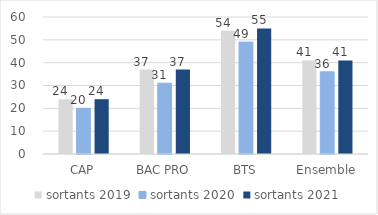
| Category | sortants 2019 | sortants 2020 | sortants 2021 |
|---|---|---|---|
| CAP | 24 | 20 | 24 |
| BAC PRO | 37 | 31 | 37 |
| BTS | 54 | 49 | 55 |
| Ensemble | 41 | 36 | 41 |